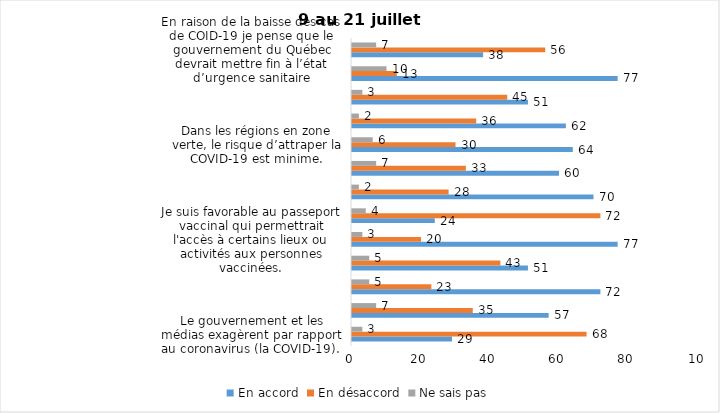
| Category | En accord | En désaccord | Ne sais pas |
|---|---|---|---|
| Le gouvernement et les médias exagèrent par rapport au coronavirus (la COVID-19). | 29 | 68 | 3 |
| J’ai peur que le système de santé soit débordé par les cas de COVID-19 suite au "déconfinement" | 57 | 35 | 7 |
| La frontière entre le Canada et les États-Unis devrait être fermée au moins jusqu’en septembre 2021 | 72 | 23 | 5 |
| Les personnes vaccinées contre la COVID-19 devraient avoir le droit de faire des rassemblements privés et de ne plus porter le masque dans les lieux publics. | 51 | 43 | 5 |
| Je suis favorable au passeport vaccinal qui permettrait l'accès à certains lieux ou activités aux personnes vaccinées. | 77 | 20 | 3 |
| Étant donné la progression de la vaccination et la diminution du nombre de cas de COVID-19, je pense qu’il est moins important de suivre les mesures de prévention. | 24 | 72 | 4 |
| Malgré la levée des mesures de confinement, je préfère limiter mes contacts avec d’autres personnes (par ex., en évitant les activités sociales et de groupes) | 70 | 28 | 2 |
| J’ai peur qu’il y ait une 4e vague de la COVID-19. | 60 | 33 | 7 |
| Dans les régions en zone verte, le risque d’attraper la COVID-19 est minime. | 64 | 30 | 6 |
| Si les cas de COVID-19 augmentent cet automne, je suis favorable à la mise en place de mesures de confinement (ex. fermeture de services non essentiels, interdiction des rassemblements privés) | 62 | 36 | 2 |
| Je suis inquiet de contracter le variant Delta de la Covid-19 | 51 | 45 | 3 |
| Je suis confiant que la vaccination protège efficacement contre les variants de la COVID-19 | 77 | 13 | 10 |
| En raison de la baisse des cas de COID-19 je pense que le gouvernement du Québec devrait mettre fin à l’état d’urgence sanitaire | 38 | 56 | 7 |